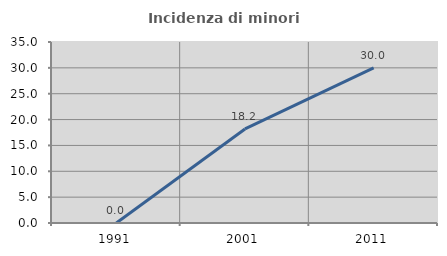
| Category | Incidenza di minori stranieri |
|---|---|
| 1991.0 | 0 |
| 2001.0 | 18.182 |
| 2011.0 | 30 |